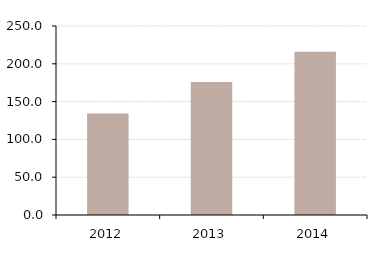
| Category | Quick Ratio |
|---|---|
| 2012.0 | 134.242 |
| 2013.0 | 176.004 |
| 2014.0 | 215.778 |